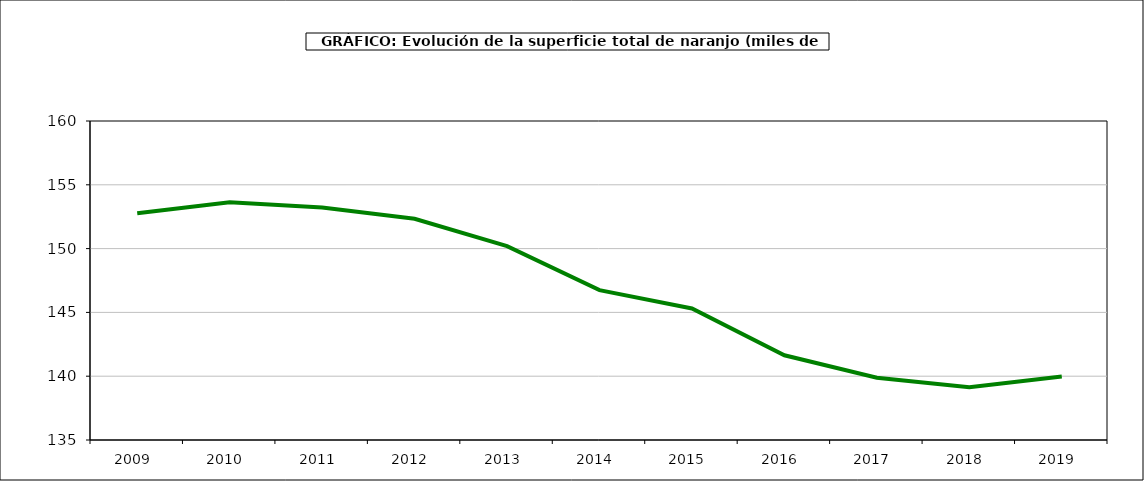
| Category | superficie |
|---|---|
| 2009.0 | 152.776 |
| 2010.0 | 153.631 |
| 2011.0 | 153.222 |
| 2012.0 | 152.34 |
| 2013.0 | 150.198 |
| 2014.0 | 146.742 |
| 2015.0 | 145.306 |
| 2016.0 | 141.639 |
| 2017.0 | 139.878 |
| 2018.0 | 139.132 |
| 2019.0 | 139.971 |